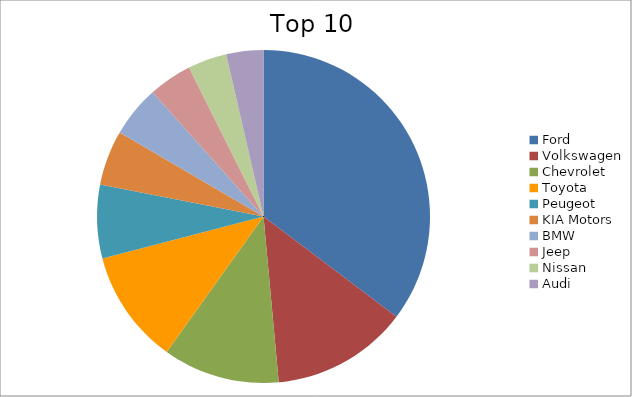
| Category | Series 0 |
|---|---|
| Ford | 35.28 |
| Volkswagen | 13.26 |
| Chevrolet | 11.33 |
| Toyota | 11.07 |
| Peugeot | 7.14 |
| KIA Motors | 5.33 |
| BMW | 4.99 |
| Jeep | 4.22 |
| Nissan | 3.78 |
| Audi | 3.6 |